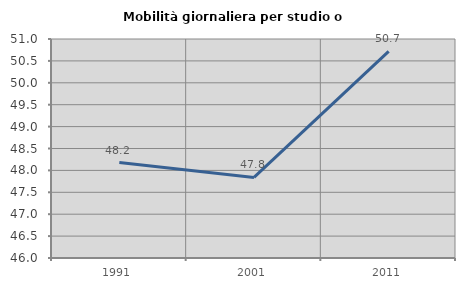
| Category | Mobilità giornaliera per studio o lavoro |
|---|---|
| 1991.0 | 48.179 |
| 2001.0 | 47.84 |
| 2011.0 | 50.716 |